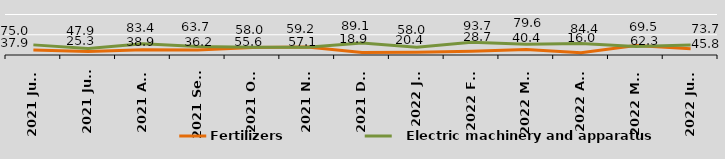
| Category | Fertilizers |   Electric machinery and apparatus |
|---|---|---|
| 2021 June | 37.9 | 75 |
| 2021 July | 25.3 | 47.9 |
| 2021 Aug | 38.9 | 83.4 |
| 2021 Sept | 36.2 | 63.7 |
| 2021 Oct | 55.6 | 58 |
| 2021 Nov | 59.2 | 57.1 |
| 2021 Dec | 18.9 | 89.1 |
| 2022 Jan | 20.4 | 58 |
| 2022 Feb | 28.7 | 93.7 |
| 2022 Mar | 40.4 | 79.6 |
| 2022 Apr | 16 | 84.4 |
| 2022 May | 69.5 | 62.3 |
| 2022 June | 45.8 | 73.7 |